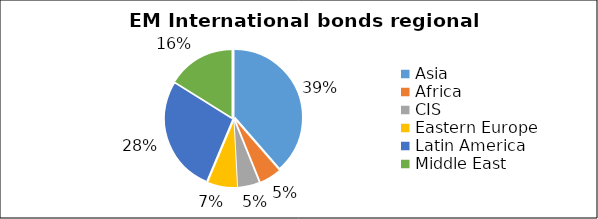
| Category | Series 0 |
|---|---|
| Asia | 1603.724 |
| Africa | 220.844 |
| CIS | 218.601 |
| Eastern Europe | 297.782 |
| Latin America | 1145.353 |
| Middle East | 670.027 |